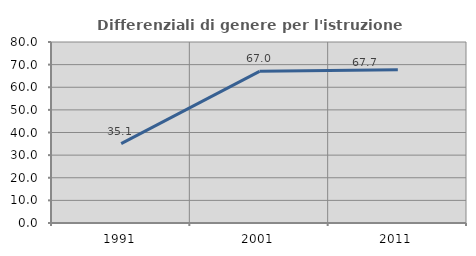
| Category | Differenziali di genere per l'istruzione superiore |
|---|---|
| 1991.0 | 35.054 |
| 2001.0 | 67.028 |
| 2011.0 | 67.727 |